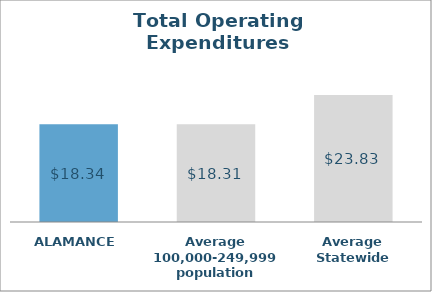
| Category | Series 0 |
|---|---|
| ALAMANCE | 18.345 |
| Average 100,000-249,999 population | 18.311 |
| Average Statewide | 23.833 |